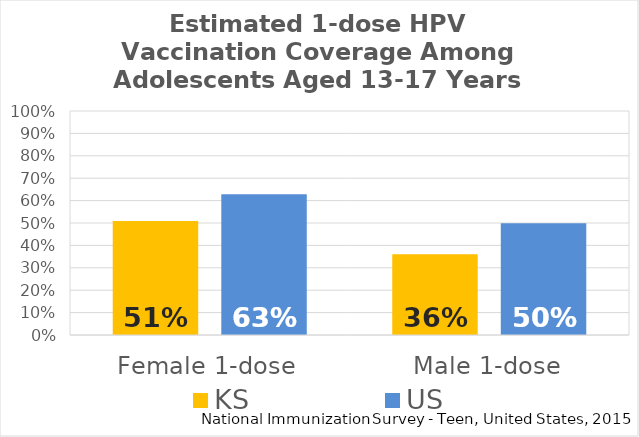
| Category | KS | US |
|---|---|---|
| Female 1-dose | 0.509 | 0.628 |
| Male 1-dose | 0.36 | 0.499 |